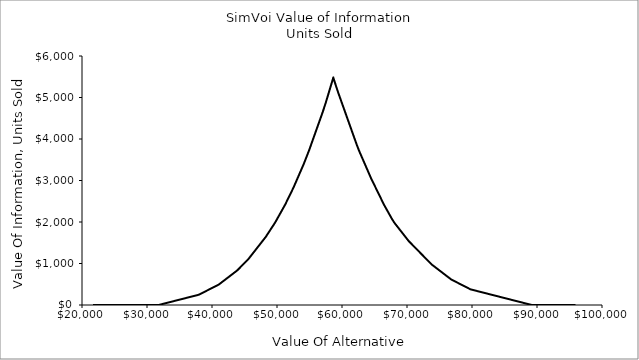
| Category | Units Sold |
|---|---|
| 21700.42155301782 | 0 |
| 21848.897025111157 | 0 |
| 21997.3724972045 | 0 |
| 22145.847969297836 | 0 |
| 22294.323441391174 | 0 |
| 22442.798913484516 | 0 |
| 22591.274385577854 | 0 |
| 22739.749857671195 | 0 |
| 22888.225329764533 | 0 |
| 23036.70080185787 | 0 |
| 23185.176273951212 | 0 |
| 23333.65174604455 | 0 |
| 23482.127218137888 | 0 |
| 23630.60269023123 | 0 |
| 23779.078162324568 | 0 |
| 23927.553634417905 | 0 |
| 24076.029106511247 | 0 |
| 24224.504578604585 | 0 |
| 24372.980050697923 | 0 |
| 24521.455522791264 | 0 |
| 24669.930994884602 | 0 |
| 24818.40646697794 | 0 |
| 24966.88193907128 | 0 |
| 25115.35741116462 | 0 |
| 25263.83288325796 | 0 |
| 25412.3083553513 | 0 |
| 25560.783827444637 | 0 |
| 25709.25929953798 | 0 |
| 25857.734771631316 | 0 |
| 26006.210243724658 | 0 |
| 26154.685715817996 | 0 |
| 26303.161187911333 | 0 |
| 26451.636660004675 | 0 |
| 26600.112132098013 | 0 |
| 26748.58760419135 | 0 |
| 26897.063076284692 | 0 |
| 27045.53854837803 | 0 |
| 27194.014020471368 | 0 |
| 27342.48949256471 | 0 |
| 27490.964964658047 | 0 |
| 27639.440436751385 | 0 |
| 27787.915908844727 | 0 |
| 27936.391380938065 | 0 |
| 28084.866853031403 | 0 |
| 28233.342325124744 | 0 |
| 28381.817797218082 | 0 |
| 28530.29326931142 | 0 |
| 28678.76874140476 | 0 |
| 28827.2442134981 | 0 |
| 28975.719685591437 | 0 |
| 29124.19515768478 | 0 |
| 29272.670629778117 | 0 |
| 29421.146101871458 | 0 |
| 29569.621573964796 | 0 |
| 29718.097046058137 | 0 |
| 29866.572518151475 | 0 |
| 30015.047990244813 | 0 |
| 30163.523462338155 | 0 |
| 30311.998934431493 | 0 |
| 30460.47440652483 | 0 |
| 30608.949878618172 | 0 |
| 30757.42535071151 | 0 |
| 30905.900822804848 | 0 |
| 31054.37629489819 | 0 |
| 31202.851766991527 | 0 |
| 31351.327239084865 | 0 |
| 31499.802711178207 | 0 |
| 31648.278183271545 | 0 |
| 31796.753655364882 | 0.501 |
| 31945.229127458224 | 6.44 |
| 32093.704599551562 | 12.379 |
| 32242.1800716449 | 18.318 |
| 32390.65554373824 | 24.257 |
| 32539.13101583158 | 30.196 |
| 32687.606487924917 | 36.135 |
| 32836.08196001826 | 42.074 |
| 32984.5574321116 | 48.013 |
| 33133.032904204934 | 53.952 |
| 33281.508376298276 | 59.891 |
| 33429.98384839162 | 65.83 |
| 33578.45932048495 | 71.769 |
| 33726.93479257829 | 77.708 |
| 33875.410264671635 | 83.647 |
| 34023.885736764976 | 89.586 |
| 34172.36120885831 | 95.525 |
| 34320.83668095165 | 101.464 |
| 34469.312153044986 | 107.403 |
| 34617.78762513833 | 113.342 |
| 34766.26309723167 | 119.281 |
| 34914.73856932501 | 125.22 |
| 35063.214041418345 | 131.159 |
| 35211.68951351169 | 137.099 |
| 35360.16498560502 | 143.038 |
| 35508.64045769836 | 148.977 |
| 35657.115929791704 | 154.916 |
| 35805.591401885045 | 160.855 |
| 35954.06687397838 | 166.794 |
| 36102.54234607172 | 172.733 |
| 36251.017818165055 | 178.672 |
| 36399.4932902584 | 184.611 |
| 36547.96876235174 | 190.55 |
| 36696.44423444508 | 196.489 |
| 36844.919706538414 | 202.428 |
| 36993.395178631756 | 208.367 |
| 37141.8706507251 | 214.306 |
| 37290.34612281843 | 220.245 |
| 37438.82159491177 | 226.184 |
| 37587.297067005115 | 232.123 |
| 37735.772539098456 | 238.062 |
| 37884.24801119179 | 244.001 |
| 38032.72348328513 | 251.945 |
| 38181.198955378466 | 263.823 |
| 38329.67442747181 | 275.701 |
| 38478.14989956515 | 287.579 |
| 38626.62537165849 | 299.457 |
| 38775.100843751825 | 311.335 |
| 38923.57631584517 | 323.213 |
| 39072.0517879385 | 335.091 |
| 39220.52726003184 | 346.969 |
| 39369.002732125184 | 358.847 |
| 39517.478204218525 | 370.725 |
| 39665.95367631186 | 382.603 |
| 39814.4291484052 | 394.481 |
| 39962.904620498535 | 406.359 |
| 40111.38009259188 | 418.237 |
| 40259.85556468522 | 430.115 |
| 40408.33103677856 | 441.994 |
| 40556.8065088719 | 453.872 |
| 40705.281980965236 | 465.75 |
| 40853.75745305857 | 477.628 |
| 41002.23292515191 | 489.506 |
| 41150.70839724525 | 505.368 |
| 41299.183869338594 | 523.185 |
| 41447.659341431936 | 541.002 |
| 41596.13481352527 | 558.819 |
| 41744.61028561861 | 576.636 |
| 41893.085757711946 | 594.453 |
| 42041.56122980529 | 612.27 |
| 42190.03670189863 | 630.087 |
| 42338.51217399197 | 647.904 |
| 42486.987646085305 | 665.721 |
| 42635.463118178646 | 683.538 |
| 42783.93859027198 | 701.355 |
| 42932.41406236532 | 719.172 |
| 43080.88953445866 | 736.989 |
| 43229.365006552005 | 754.806 |
| 43377.84047864534 | 772.623 |
| 43526.31595073868 | 790.44 |
| 43674.791422832015 | 808.258 |
| 43823.26689492536 | 826.075 |
| 43971.7423670187 | 847.541 |
| 44120.21783911204 | 871.297 |
| 44268.69331120538 | 895.053 |
| 44417.168783298715 | 918.809 |
| 44565.64425539205 | 942.565 |
| 44714.11972748539 | 966.321 |
| 44862.59519957873 | 990.077 |
| 45011.070671672074 | 1013.833 |
| 45159.546143765416 | 1037.589 |
| 45308.02161585875 | 1061.345 |
| 45456.49708795209 | 1085.101 |
| 45604.972560045426 | 1108.857 |
| 45753.44803213877 | 1137.572 |
| 45901.92350423211 | 1167.267 |
| 46050.39897632545 | 1196.962 |
| 46198.874448418785 | 1226.657 |
| 46347.349920512126 | 1256.352 |
| 46495.82539260546 | 1286.047 |
| 46644.3008646988 | 1315.742 |
| 46792.77633679214 | 1345.437 |
| 46941.251808885485 | 1375.132 |
| 47089.72728097882 | 1404.827 |
| 47238.20275307216 | 1434.523 |
| 47386.678225165495 | 1464.218 |
| 47535.15369725884 | 1493.913 |
| 47683.62916935218 | 1523.608 |
| 47832.10464144552 | 1553.303 |
| 47980.58011353886 | 1582.998 |
| 48129.055585632195 | 1612.693 |
| 48277.53105772553 | 1642.947 |
| 48426.00652981887 | 1678.581 |
| 48574.48200191221 | 1714.215 |
| 48722.957474005554 | 1749.849 |
| 48871.432946098896 | 1785.483 |
| 49019.90841819223 | 1821.117 |
| 49168.383890285564 | 1856.751 |
| 49316.859362378906 | 1892.385 |
| 49465.33483447225 | 1928.02 |
| 49613.81030656559 | 1963.654 |
| 49762.28577865893 | 2000.739 |
| 49910.761250752264 | 2042.312 |
| 50059.236722845606 | 2083.885 |
| 50207.71219493894 | 2125.458 |
| 50356.18766703228 | 2167.031 |
| 50504.66313912562 | 2208.604 |
| 50653.138611218965 | 2250.177 |
| 50801.6140833123 | 2291.751 |
| 50950.08955540564 | 2333.324 |
| 51098.565027498975 | 2374.897 |
| 51247.040499592316 | 2416.47 |
| 51395.51597168566 | 2463.644 |
| 51543.991443779 | 2511.156 |
| 51692.46691587234 | 2558.668 |
| 51840.942387965675 | 2606.18 |
| 51989.41786005901 | 2653.692 |
| 52137.89333215235 | 2701.205 |
| 52286.36880424569 | 2748.717 |
| 52434.844276339034 | 2796.229 |
| 52583.319748432375 | 2845.972 |
| 52731.79522052571 | 2899.423 |
| 52880.270692619044 | 2952.874 |
| 53028.746164712386 | 3006.325 |
| 53177.22163680573 | 3059.777 |
| 53325.69710889907 | 3113.228 |
| 53474.17258099241 | 3166.679 |
| 53622.648053085744 | 3220.13 |
| 53771.123525179086 | 3273.581 |
| 53919.59899727242 | 3327.032 |
| 54068.07446936576 | 3380.484 |
| 54216.5499414591 | 3438.534 |
| 54365.025413552445 | 3497.924 |
| 54513.50088564578 | 3557.314 |
| 54661.97635773912 | 3616.704 |
| 54810.45182983246 | 3676.094 |
| 54958.927301925796 | 3736.714 |
| 55107.40277401914 | 3802.043 |
| 55255.87824611248 | 3867.372 |
| 55404.35371820581 | 3932.702 |
| 55552.829190299155 | 3998.031 |
| 55701.3046623925 | 4063.36 |
| 55849.78013448583 | 4128.689 |
| 55998.25560657917 | 4194.019 |
| 56146.731078672514 | 4259.348 |
| 56295.20655076585 | 4324.677 |
| 56443.68202285919 | 4390.006 |
| 56592.15749495253 | 4455.335 |
| 56740.632967045865 | 4520.665 |
| 56889.10843913921 | 4585.994 |
| 57037.58391123255 | 4651.864 |
| 57186.05938332588 | 4723.132 |
| 57334.534855419224 | 4794.401 |
| 57483.010327512566 | 4865.669 |
| 57631.4857996059 | 4942.598 |
| 57779.96127169924 | 5019.805 |
| 57928.43674379258 | 5097.012 |
| 58076.912215885925 | 5174.22 |
| 58225.38768797926 | 5251.427 |
| 58373.8631600726 | 5328.634 |
| 58522.33863216594 | 5405.841 |
| 58661.49398605371 | 5478.202 |
| 58670.814104259276 | 5473.729 |
| 58819.28957635262 | 5402.46 |
| 58967.76504844596 | 5331.192 |
| 59116.24052053929 | 5259.924 |
| 59264.715992632635 | 5188.656 |
| 59413.19146472598 | 5118.413 |
| 59561.66693681931 | 5053.084 |
| 59710.14240891265 | 4987.755 |
| 59858.617881005994 | 4922.425 |
| 60007.09335309933 | 4857.096 |
| 60155.56882519267 | 4791.767 |
| 60304.04429728601 | 4726.438 |
| 60452.519769379345 | 4661.109 |
| 60600.99524147269 | 4595.779 |
| 60749.47071356603 | 4530.45 |
| 60897.94618565936 | 4465.121 |
| 61046.421657752704 | 4399.792 |
| 61194.897129846046 | 4334.463 |
| 61343.37260193938 | 4269.133 |
| 61491.84807403272 | 4203.804 |
| 61640.32354612606 | 4138.475 |
| 61788.799018219404 | 4073.146 |
| 61937.27449031274 | 4007.817 |
| 62085.74996240608 | 3942.487 |
| 62234.22543449942 | 3877.158 |
| 62382.700906592756 | 3815.222 |
| 62531.1763786861 | 3755.831 |
| 62679.65185077944 | 3698.091 |
| 62828.12732287277 | 3644.64 |
| 62976.602794966115 | 3591.188 |
| 63125.078267059456 | 3537.737 |
| 63273.55373915279 | 3484.286 |
| 63422.02921124613 | 3430.835 |
| 63570.50468333947 | 3377.384 |
| 63718.98015543281 | 3323.933 |
| 63867.45562752615 | 3270.481 |
| 64015.93109961949 | 3217.03 |
| 64164.406571712825 | 3163.579 |
| 64312.88204380617 | 3110.128 |
| 64461.35751589951 | 3056.677 |
| 64609.83298799284 | 3008.482 |
| 64758.308460086184 | 2960.97 |
| 64906.783932179525 | 2913.458 |
| 65055.25940427286 | 2865.946 |
| 65203.7348763662 | 2818.434 |
| 65352.21034845954 | 2770.922 |
| 65500.685820552884 | 2723.41 |
| 65649.16129264623 | 2675.897 |
| 65797.63676473955 | 2628.385 |
| 65946.11223683291 | 2580.873 |
| 66094.58770892624 | 2533.361 |
| 66243.06318101958 | 2485.849 |
| 66391.53865311292 | 2438.337 |
| 66540.01412520625 | 2394.23 |
| 66688.4895972996 | 2352.657 |
| 66836.96506939293 | 2311.084 |
| 66985.44054148627 | 2269.511 |
| 67133.91601357961 | 2227.938 |
| 67282.39148567295 | 2186.365 |
| 67430.8669577663 | 2144.791 |
| 67579.34242985962 | 2103.218 |
| 67727.81790195298 | 2061.961 |
| 67876.2933740463 | 2026.327 |
| 68024.76884613965 | 1990.692 |
| 68173.24431823299 | 1958.28 |
| 68321.71979032631 | 1928.585 |
| 68470.19526241967 | 1898.89 |
| 68618.670734513 | 1869.195 |
| 68767.14620660634 | 1839.5 |
| 68915.62167869968 | 1809.805 |
| 69064.09715079302 | 1780.11 |
| 69212.57262288636 | 1750.415 |
| 69361.04809497969 | 1720.719 |
| 69509.52356707305 | 1691.024 |
| 69657.99903916637 | 1661.329 |
| 69806.47451125972 | 1631.634 |
| 69954.94998335306 | 1601.939 |
| 70103.4254554464 | 1572.244 |
| 70251.90092753974 | 1542.664 |
| 70400.37639963307 | 1518.908 |
| 70548.85187172642 | 1495.152 |
| 70697.32734381975 | 1471.396 |
| 70845.80281591309 | 1447.64 |
| 70994.27828800643 | 1423.884 |
| 71142.75376009976 | 1400.128 |
| 71291.22923219312 | 1376.372 |
| 71439.70470428644 | 1352.616 |
| 71588.18017637978 | 1328.86 |
| 71736.65564847313 | 1305.103 |
| 71885.13112056647 | 1281.347 |
| 72033.60659265981 | 1257.591 |
| 72182.08206475314 | 1233.835 |
| 72330.55753684649 | 1210.079 |
| 72479.03300893982 | 1186.323 |
| 72627.50848103316 | 1162.567 |
| 72775.9839531265 | 1138.811 |
| 72924.45942521983 | 1115.055 |
| 73072.93489731319 | 1091.299 |
| 73221.41036940651 | 1067.543 |
| 73369.88584149987 | 1043.787 |
| 73518.3613135932 | 1020.031 |
| 73666.83678568654 | 996.275 |
| 73815.31225777988 | 973.897 |
| 73963.7877298732 | 956.08 |
| 74112.26320196656 | 938.263 |
| 74260.73867405989 | 920.446 |
| 74409.21414615323 | 902.629 |
| 74557.68961824657 | 884.812 |
| 74706.16509033991 | 866.995 |
| 74854.64056243325 | 849.178 |
| 75003.11603452658 | 831.361 |
| 75151.59150661994 | 813.544 |
| 75300.06697871326 | 795.727 |
| 75448.5424508066 | 777.91 |
| 75597.01792289995 | 760.093 |
| 75745.49339499327 | 742.276 |
| 75893.96886708663 | 724.459 |
| 76042.44433917996 | 706.642 |
| 76190.9198112733 | 688.825 |
| 76339.39528336664 | 671.007 |
| 76487.87075545998 | 653.19 |
| 76636.34622755332 | 635.373 |
| 76784.82169964665 | 617.556 |
| 76933.29717174 | 604.525 |
| 77081.77264383333 | 592.647 |
| 77230.24811592668 | 580.769 |
| 77378.72358802002 | 568.891 |
| 77527.19906011336 | 557.013 |
| 77675.6745322067 | 545.135 |
| 77824.15000430003 | 533.257 |
| 77972.62547639338 | 521.379 |
| 78121.10094848671 | 509.501 |
| 78269.57642058005 | 497.623 |
| 78418.0518926734 | 485.745 |
| 78566.52736476672 | 473.867 |
| 78715.00283686008 | 461.989 |
| 78863.4783089534 | 450.111 |
| 79011.95378104674 | 438.233 |
| 79160.42925314009 | 426.355 |
| 79308.90472523343 | 414.477 |
| 79457.38019732677 | 402.599 |
| 79605.8556694201 | 390.721 |
| 79754.33114151345 | 378.843 |
| 79902.80661360678 | 371.921 |
| 80051.28208570012 | 365.982 |
| 80199.75755779346 | 360.043 |
| 80348.23302988679 | 354.103 |
| 80496.70850198015 | 348.164 |
| 80645.18397407347 | 342.225 |
| 80793.65944616683 | 336.286 |
| 80942.13491826016 | 330.347 |
| 81090.6103903535 | 324.408 |
| 81239.08586244684 | 318.469 |
| 81387.56133454017 | 312.53 |
| 81536.03680663352 | 306.591 |
| 81684.51227872685 | 300.652 |
| 81832.98775082019 | 294.713 |
| 81981.46322291353 | 288.774 |
| 82129.93869500687 | 282.835 |
| 82278.41416710021 | 276.896 |
| 82426.88963919354 | 270.957 |
| 82575.3651112869 | 265.018 |
| 82723.84058338022 | 259.079 |
| 82872.31605547357 | 253.14 |
| 83020.79152756691 | 247.201 |
| 83169.26699966023 | 241.262 |
| 83317.74247175359 | 235.323 |
| 83466.21794384692 | 229.384 |
| 83614.69341594026 | 223.445 |
| 83763.1688880336 | 217.506 |
| 83911.64436012694 | 211.567 |
| 84060.11983222028 | 205.628 |
| 84208.59530431361 | 199.689 |
| 84357.07077640697 | 193.75 |
| 84505.5462485003 | 187.811 |
| 84654.02172059364 | 181.872 |
| 84802.49719268698 | 175.933 |
| 84950.97266478032 | 169.994 |
| 85099.44813687366 | 164.055 |
| 85247.92360896699 | 158.116 |
| 85396.39908106034 | 152.177 |
| 85544.87455315367 | 146.238 |
| 85693.35002524701 | 140.299 |
| 85841.82549734035 | 134.36 |
| 85990.30096943368 | 128.421 |
| 86138.77644152704 | 122.482 |
| 86287.25191362036 | 116.543 |
| 86435.7273857137 | 110.604 |
| 86584.20285780705 | 104.665 |
| 86732.67832990039 | 98.726 |
| 86881.15380199373 | 92.787 |
| 87029.62927408706 | 86.848 |
| 87178.10474618041 | 80.909 |
| 87326.58021827374 | 74.97 |
| 87475.05569036708 | 69.031 |
| 87623.53116246042 | 63.092 |
| 87772.00663455376 | 57.153 |
| 87920.4821066471 | 51.214 |
| 88068.95757874043 | 45.275 |
| 88217.43305083377 | 39.335 |
| 88365.90852292711 | 33.396 |
| 88514.38399502046 | 27.457 |
| 88662.8594671138 | 21.518 |
| 88811.33493920714 | 15.579 |
| 88959.81041130047 | 9.64 |
| 89108.28588339381 | 3.701 |
| 89256.76135548715 | 0 |
| 89405.23682758049 | 0 |
| 89553.71229967383 | 0 |
| 89702.18777176717 | 0 |
| 89850.6632438605 | 0 |
| 89999.13871595384 | 0 |
| 90147.61418804718 | 0 |
| 90296.08966014053 | 0 |
| 90444.56513223387 | 0 |
| 90593.04060432721 | 0 |
| 90741.51607642055 | 0 |
| 90889.99154851388 | 0 |
| 91038.46702060722 | 0 |
| 91186.94249270056 | 0 |
| 91335.4179647939 | 0 |
| 91483.89343688724 | 0 |
| 91632.36890898058 | 0 |
| 91780.84438107391 | 0 |
| 91929.31985316725 | 0 |
| 92077.7953252606 | 0 |
| 92226.27079735394 | 0 |
| 92374.74626944728 | 0 |
| 92523.22174154062 | 0 |
| 92671.69721363395 | 0 |
| 92820.17268572729 | 0 |
| 92968.64815782063 | 0 |
| 93117.12362991397 | 0 |
| 93265.59910200731 | 0 |
| 93414.07457410065 | 0 |
| 93562.55004619398 | 0 |
| 93711.02551828732 | 0 |
| 93859.50099038066 | 0 |
| 94007.976462474 | 0 |
| 94156.45193456735 | 0 |
| 94304.92740666069 | 0 |
| 94453.40287875403 | 0 |
| 94601.87835084736 | 0 |
| 94750.3538229407 | 0 |
| 94898.82929503404 | 0 |
| 95047.30476712738 | 0 |
| 95195.78023922072 | 0 |
| 95344.25571131406 | 0 |
| 95492.73118340739 | 0 |
| 95641.20665550073 | 0 |
| 95789.68212759407 | 0 |
| 95938.15759968742 | 0 |